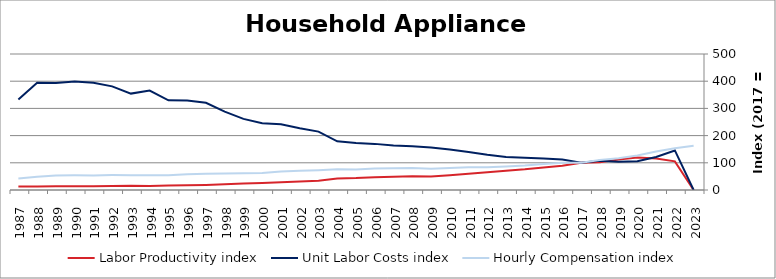
| Category | Labor Productivity index | Unit Labor Costs index | Hourly Compensation index |
|---|---|---|---|
| 2023.0 | 0 | 0 | 163.005 |
| 2022.0 | 105.257 | 145.443 | 153.089 |
| 2021.0 | 116.205 | 121.549 | 141.246 |
| 2020.0 | 119.542 | 106.037 | 126.759 |
| 2019.0 | 112.082 | 103.804 | 116.346 |
| 2018.0 | 102.295 | 107.414 | 109.879 |
| 2017.0 | 100 | 100 | 100 |
| 2016.0 | 89.337 | 112.399 | 100.414 |
| 2015.0 | 82.494 | 116.016 | 95.706 |
| 2014.0 | 75.855 | 118.527 | 89.909 |
| 2013.0 | 71.15 | 121.165 | 86.209 |
| 2012.0 | 64.894 | 129.316 | 83.918 |
| 2011.0 | 59.726 | 139.339 | 83.222 |
| 2010.0 | 54.373 | 148.936 | 80.982 |
| 2009.0 | 49.86 | 156.355 | 77.959 |
| 2008.0 | 50.124 | 160.458 | 80.428 |
| 2007.0 | 48.836 | 163.302 | 79.751 |
| 2006.0 | 46.814 | 169.565 | 79.38 |
| 2005.0 | 43.84 | 172.406 | 75.583 |
| 2004.0 | 42.458 | 178.825 | 75.926 |
| 2003.0 | 33.973 | 214.76 | 72.96 |
| 2002.0 | 31.046 | 227.078 | 70.5 |
| 2001.0 | 28.29 | 241.435 | 68.301 |
| 2000.0 | 25.381 | 245.048 | 62.196 |
| 1999.0 | 23.6 | 261.376 | 61.684 |
| 1998.0 | 21.087 | 287.932 | 60.717 |
| 1997.0 | 18.659 | 320.548 | 59.809 |
| 1996.0 | 17.605 | 329.325 | 57.977 |
| 1995.0 | 16.512 | 329.69 | 54.438 |
| 1994.0 | 14.891 | 365.684 | 54.453 |
| 1993.0 | 15.414 | 354.422 | 54.629 |
| 1992.0 | 14.367 | 380.934 | 54.728 |
| 1991.0 | 13.627 | 394.233 | 53.721 |
| 1990.0 | 13.497 | 399.283 | 53.892 |
| 1989.0 | 13.522 | 393.095 | 53.153 |
| 1988.0 | 12.417 | 394.527 | 48.987 |
| 1987.0 | 12.661 | 333.137 | 42.179 |